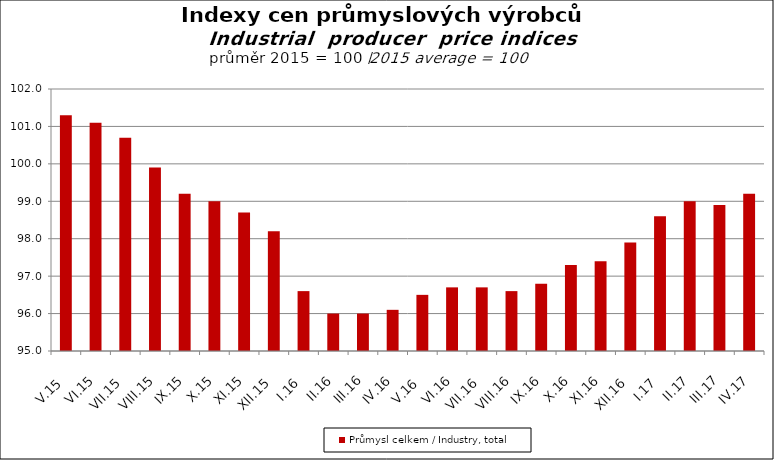
| Category | Průmysl celkem / Industry, total |
|---|---|
| V.15 | 101.3 |
| VI.15 | 101.1 |
| VII.15 | 100.7 |
| VIII.15 | 99.9 |
| IX.15 | 99.2 |
| X.15 | 99 |
| XI.15 | 98.7 |
| XII.15 | 98.2 |
| I.16 | 96.6 |
| II.16 | 96 |
| III.16 | 96 |
| IV.16 | 96.1 |
| V.16 | 96.5 |
| VI.16 | 96.7 |
| VII.16 | 96.7 |
| VIII.16 | 96.6 |
| IX.16 | 96.8 |
| X.16 | 97.3 |
| XI.16 | 97.4 |
| XII.16 | 97.9 |
| I.17 | 98.6 |
| II.17 | 99 |
| III.17 | 98.9 |
| IV.17 | 99.2 |